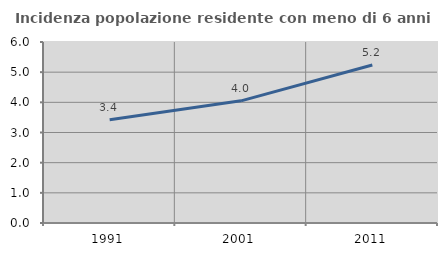
| Category | Incidenza popolazione residente con meno di 6 anni |
|---|---|
| 1991.0 | 3.424 |
| 2001.0 | 4.05 |
| 2011.0 | 5.237 |